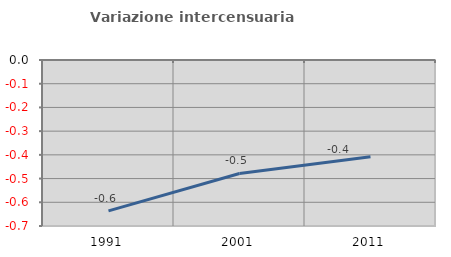
| Category | Variazione intercensuaria annua |
|---|---|
| 1991.0 | -0.636 |
| 2001.0 | -0.479 |
| 2011.0 | -0.408 |